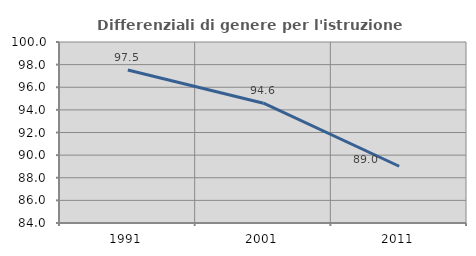
| Category | Differenziali di genere per l'istruzione superiore |
|---|---|
| 1991.0 | 97.532 |
| 2001.0 | 94.59 |
| 2011.0 | 89.016 |